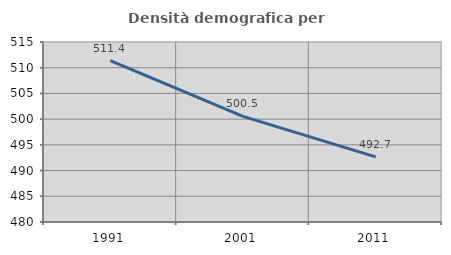
| Category | Densità demografica |
|---|---|
| 1991.0 | 511.363 |
| 2001.0 | 500.548 |
| 2011.0 | 492.66 |